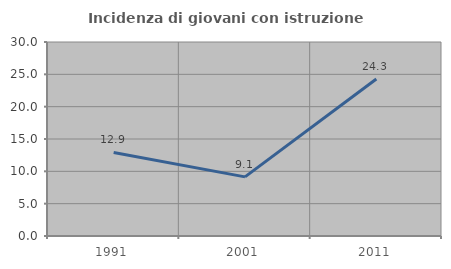
| Category | Incidenza di giovani con istruzione universitaria |
|---|---|
| 1991.0 | 12.925 |
| 2001.0 | 9.146 |
| 2011.0 | 24.286 |